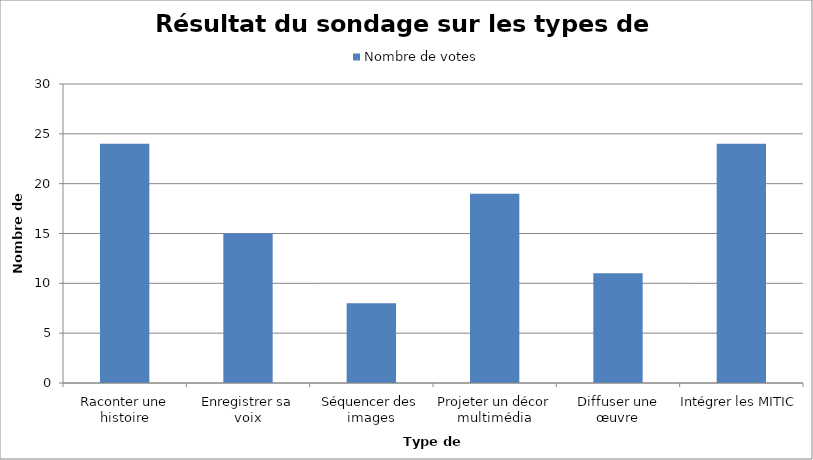
| Category | Nombre de votes |
|---|---|
| Raconter une histoire | 24 |
| Enregistrer sa voix | 15 |
| Séquencer des images | 8 |
| Projeter un décor multimédia | 19 |
| Diffuser une œuvre | 11 |
| Intégrer les MITIC | 24 |